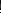
| Category | Series 0 |
|---|---|
| 2h.1 | 1.76 |
| 2h.2 | 1.32 |
| 6h.1 | 2.48 |
| 6h.2 | 2.72 |
| 30h.1 | 3.12 |
| 30h.2 | 2.71 |